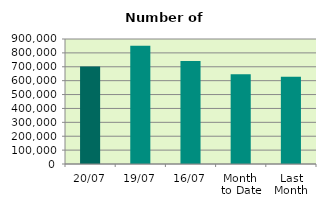
| Category | Series 0 |
|---|---|
| 20/07 | 702792 |
| 19/07 | 851952 |
| 16/07 | 740722 |
| Month 
to Date | 645942.571 |
| Last
Month | 628899 |